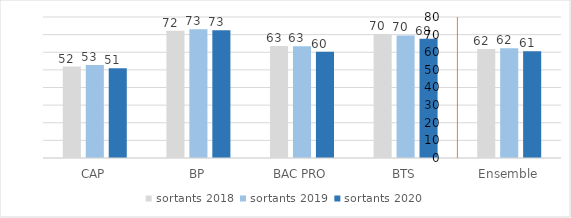
| Category | sortants 2018 | sortants 2019 | sortants 2020 |
|---|---|---|---|
| CAP | 51.85 | 52.83 | 50.95 |
| BP | 72.24 | 73.07 | 72.51 |
| BAC PRO | 63.48 | 63.4 | 60.3 |
| BTS | 70.39 | 69.53 | 67.6 |
| Ensemble | 61.84 | 62.33 | 60.54 |